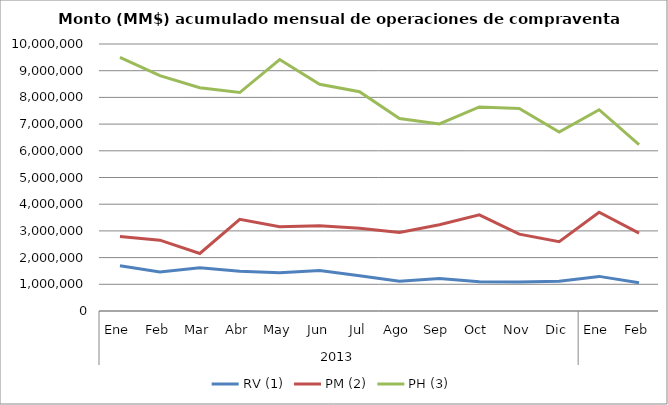
| Category | RV (1) | PM (2) | PH (3) |
|---|---|---|---|
| 0 | 1693090.019 | 2788692.01 | 9495719.157 |
| 1 | 1457870.523 | 2652319.476 | 8814454.346 |
| 2 | 1619570.46 | 2155113.626 | 8361658.957 |
| 3 | 1485677.791 | 3434435.881 | 8182321.991 |
| 4 | 1434943.507 | 3155786.06 | 9417818.094 |
| 5 | 1516566.545 | 3191285.457 | 8490151.421 |
| 6 | 1322115.523 | 3099755.507 | 8212010.547 |
| 7 | 1118245.895 | 2937089.197 | 7211658.784 |
| 8 | 1215047.725 | 3232334.418 | 7008526.172 |
| 9 | 1092035.083 | 3603082.09 | 7640993.748 |
| 10 | 1088055.605 | 2879188.198 | 7583918.365 |
| 11 | 1114851.326 | 2596986.123 | 6700659.979 |
| 12 | 1296256.43 | 3700290.091 | 7538361.261 |
| 13 | 1061199.219 | 2915830.381 | 6230064.605 |